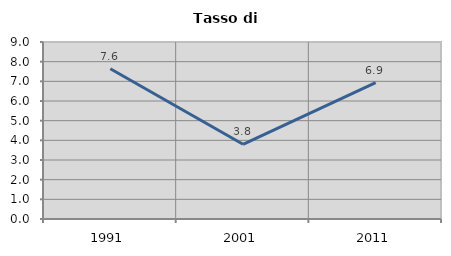
| Category | Tasso di disoccupazione   |
|---|---|
| 1991.0 | 7.643 |
| 2001.0 | 3.798 |
| 2011.0 | 6.938 |